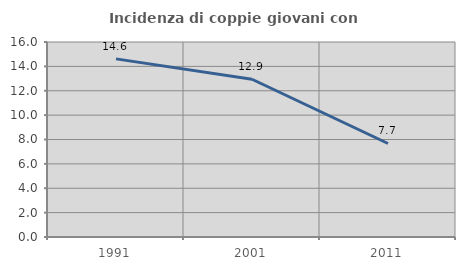
| Category | Incidenza di coppie giovani con figli |
|---|---|
| 1991.0 | 14.617 |
| 2001.0 | 12.944 |
| 2011.0 | 7.672 |